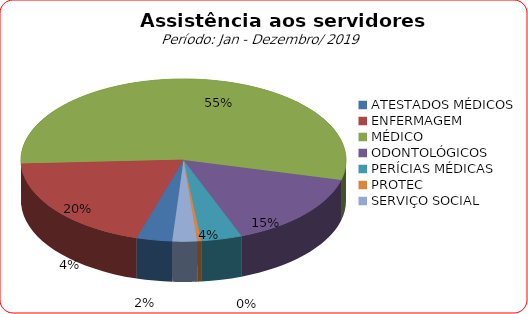
| Category | Series 0 |
|---|---|
| ATESTADOS MÉDICOS | 3.534 |
| ENFERMAGEM | 19.578 |
| MÉDICO | 54.73 |
| ODONTOLÓGICOS | 15.262 |
| PERÍCIAS MÉDICAS | 4.05 |
| PROTEC | 0.391 |
| SERVIÇO SOCIAL | 2.455 |